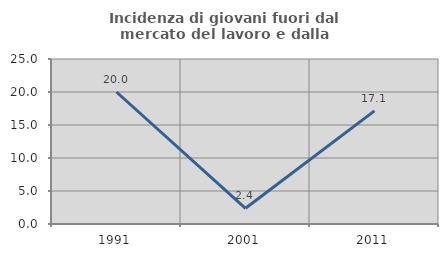
| Category | Incidenza di giovani fuori dal mercato del lavoro e dalla formazione  |
|---|---|
| 1991.0 | 20 |
| 2001.0 | 2.381 |
| 2011.0 | 17.143 |